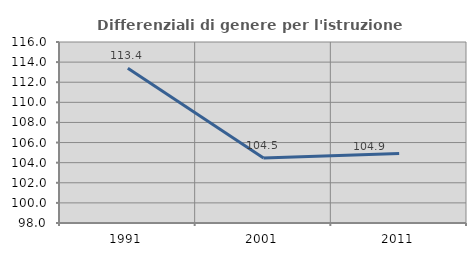
| Category | Differenziali di genere per l'istruzione superiore |
|---|---|
| 1991.0 | 113.4 |
| 2001.0 | 104.453 |
| 2011.0 | 104.923 |